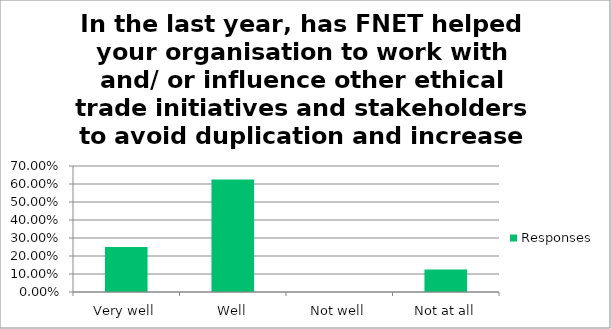
| Category | Responses |
|---|---|
| Very well | 0.25 |
| Well | 0.625 |
| Not well | 0 |
| Not at all | 0.125 |